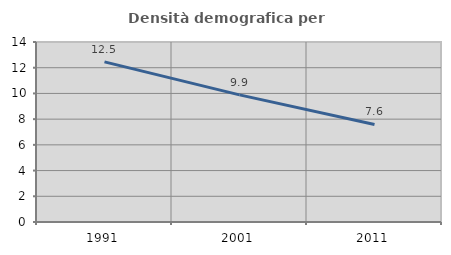
| Category | Densità demografica |
|---|---|
| 1991.0 | 12.451 |
| 2001.0 | 9.888 |
| 2011.0 | 7.586 |